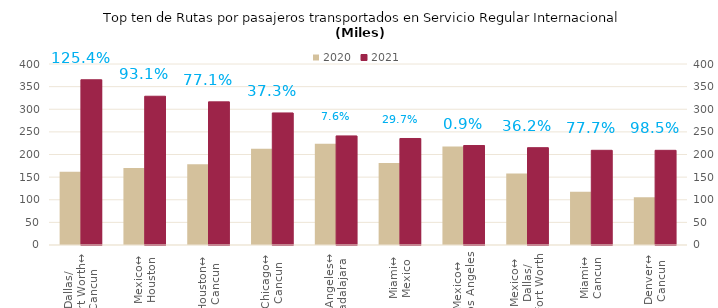
| Category | 2020 | 2021 |
|---|---|---|
| Dallas/
Fort Worth↔
Cancun | 161.979 | 365.126 |
| Mexico↔
Houston | 170.273 | 328.759 |
| Houston↔
Cancun | 178.608 | 316.301 |
| Chicago↔
Cancun | 212.564 | 291.838 |
| Los Angeles↔
Guadalajara | 224.019 | 241.087 |
| Miami↔
Mexico | 181.422 | 235.39 |
| Mexico↔
Los Angeles | 217.829 | 219.848 |
| Mexico↔
Dallas/
Fort Worth | 157.949 | 215.066 |
| Miami↔
Cancun | 117.786 | 209.273 |
| Denver↔
Cancun | 105.393 | 209.221 |